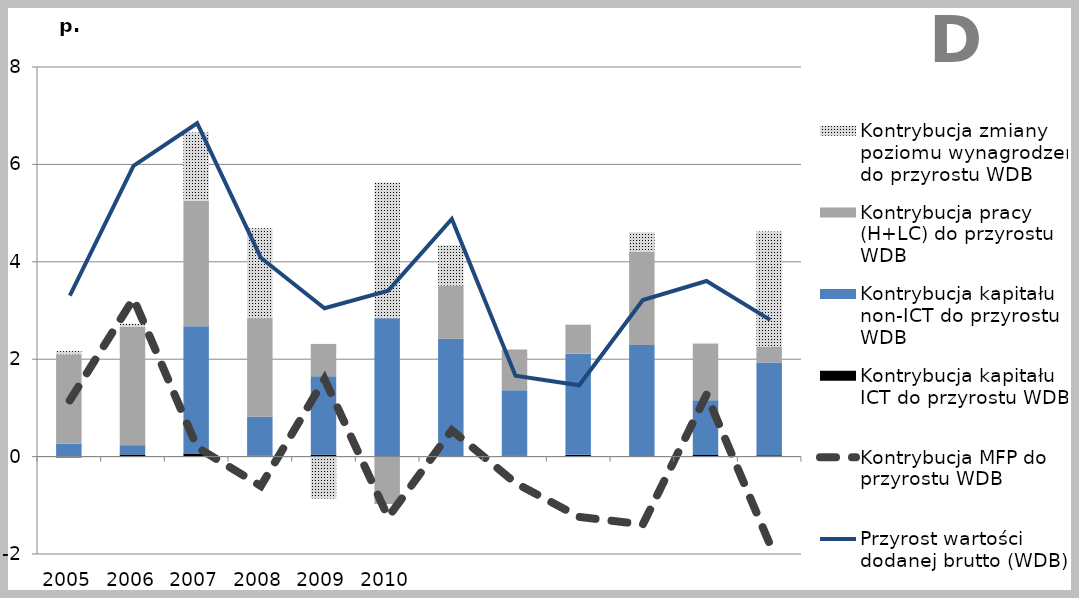
| Category | Kontrybucja kapitału ICT do przyrostu WDB | Kontrybucja kapitału non-ICT do przyrostu WDB | Kontrybucja pracy (H+LC) do przyrostu WDB | Kontrybucja zmiany poziomu wynagrodzeń do przyrostu WDB |
|---|---|---|---|---|
| 2005.0 | -0.017 | 0.263 | 1.836 | 0.067 |
| 2006.0 | 0.043 | 0.192 | 2.425 | 0.066 |
| 2007.0 | 0.064 | 2.612 | 2.58 | 1.397 |
| 2008.0 | 0.018 | 0.802 | 2.019 | 1.849 |
| 2009.0 | 0.038 | 1.611 | 0.665 | -0.859 |
| 2010.0 | -0.007 | 2.84 | -0.968 | 2.787 |